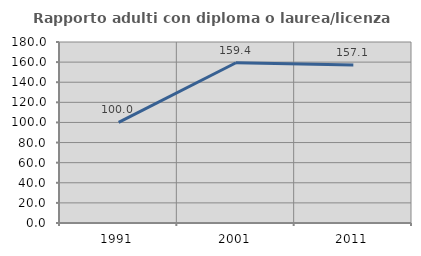
| Category | Rapporto adulti con diploma o laurea/licenza media  |
|---|---|
| 1991.0 | 100 |
| 2001.0 | 159.375 |
| 2011.0 | 157.143 |